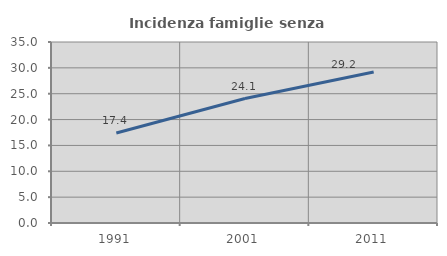
| Category | Incidenza famiglie senza nuclei |
|---|---|
| 1991.0 | 17.402 |
| 2001.0 | 24.067 |
| 2011.0 | 29.204 |